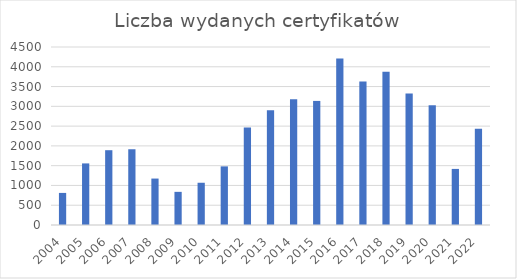
| Category | Liczba wydanych certyfikatów |
|---|---|
| 2004.0 | 811 |
| 2005.0 | 1557 |
| 2006.0 | 1891 |
| 2007.0 | 1915 |
| 2008.0 | 1174 |
| 2009.0 | 838 |
| 2010.0 | 1068 |
| 2011.0 | 1482 |
| 2012.0 | 2465 |
| 2013.0 | 2898 |
| 2014.0 | 3178 |
| 2015.0 | 3137 |
| 2016.0 | 4207 |
| 2017.0 | 3628 |
| 2018.0 | 3876 |
| 2019.0 | 3325 |
| 2020.0 | 3027 |
| 2021.0 | 1418 |
| 2022.0 | 2436 |